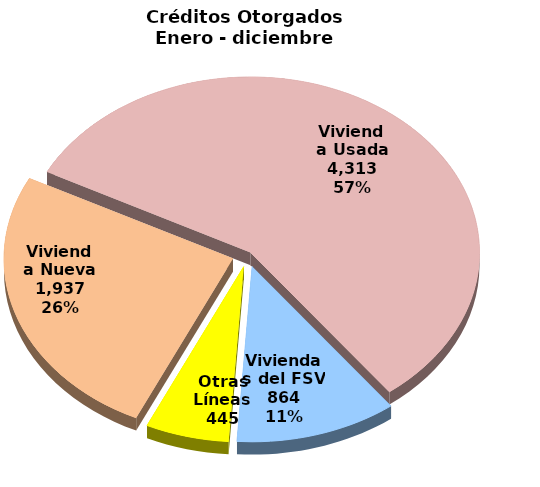
| Category | Series 0 |
|---|---|
| Vivienda Nueva | 1937 |
| Vivienda Usada | 4313 |
| Viviendas del FSV | 864 |
| Otras Líneas | 445 |